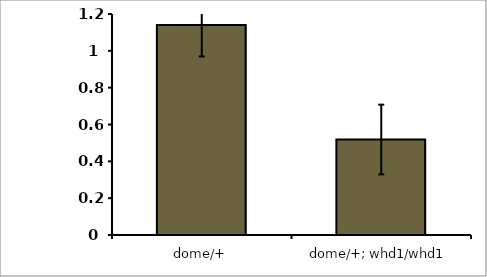
| Category | Series 0 |
|---|---|
| dome/+ | 1.14 |
| dome/+; whd1/whd1 | 0.518 |